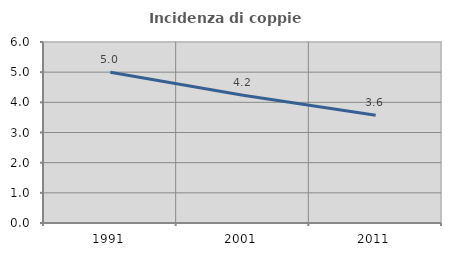
| Category | Incidenza di coppie miste |
|---|---|
| 1991.0 | 5 |
| 2001.0 | 4.237 |
| 2011.0 | 3.571 |